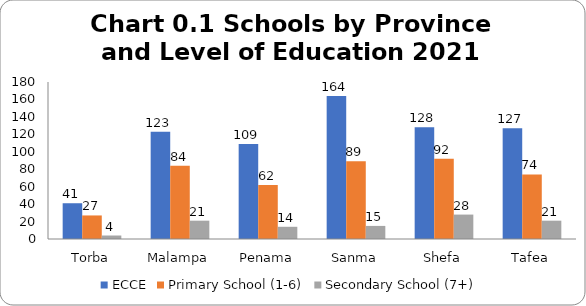
| Category | ECCE | Primary School (1-6) | Secondary School (7+) |
|---|---|---|---|
| Torba | 41 | 27 | 4 |
| Malampa | 123 | 84 | 21 |
| Penama | 109 | 62 | 14 |
| Sanma | 164 | 89 | 15 |
| Shefa | 128 | 92 | 28 |
| Tafea | 127 | 74 | 21 |